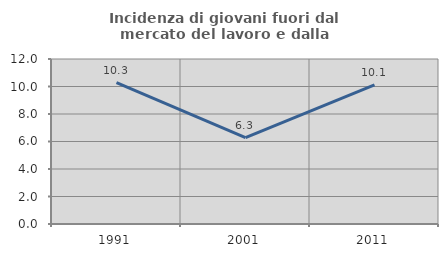
| Category | Incidenza di giovani fuori dal mercato del lavoro e dalla formazione  |
|---|---|
| 1991.0 | 10.277 |
| 2001.0 | 6.278 |
| 2011.0 | 10.121 |